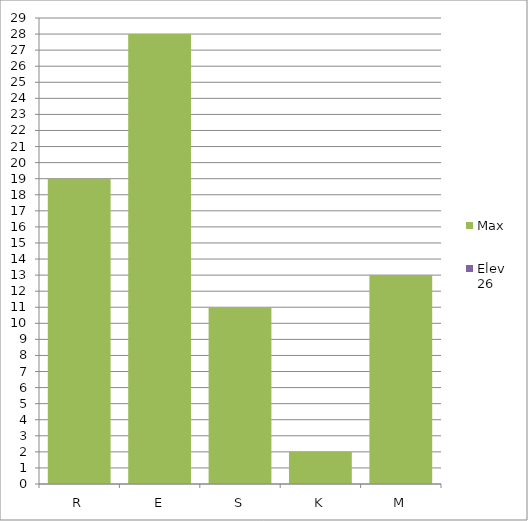
| Category | Max | Elev 26 |
|---|---|---|
| R | 19 | 0 |
| E | 28 | 0 |
| S | 11 | 0 |
| K | 2 | 0 |
| M | 13 | 0 |